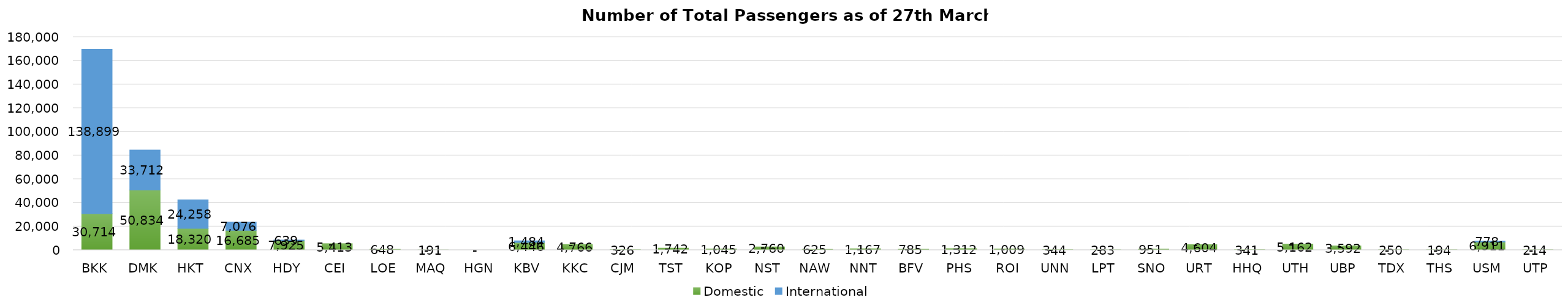
| Category | Domestic | International |
|---|---|---|
| BKK | 30714 | 138899 |
| DMK | 50834 | 33712 |
| HKT | 18320 | 24258 |
| CNX | 16685 | 7076 |
| HDY | 7925 | 639 |
| CEI | 5413 | 0 |
| LOE | 648 | 0 |
| MAQ | 191 | 0 |
| HGN | 0 | 0 |
| KBV | 6446 | 1484 |
| KKC | 4766 | 0 |
| CJM | 326 | 0 |
| TST | 1742 | 0 |
| KOP | 1045 | 0 |
| NST | 2760 | 0 |
| NAW | 625 | 0 |
| NNT | 1167 | 0 |
| BFV | 785 | 0 |
| PHS | 1312 | 0 |
| ROI | 1009 | 0 |
| UNN | 344 | 0 |
| LPT | 283 | 0 |
| SNO | 951 | 0 |
| URT | 4604 | 0 |
| HHQ | 341 | 0 |
| UTH | 5162 | 0 |
| UBP | 3592 | 0 |
| TDX | 250 | 0 |
| THS | 194 | 0 |
| USM | 6911 | 778 |
| UTP | 214 | 0 |